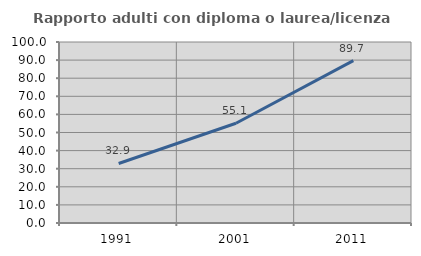
| Category | Rapporto adulti con diploma o laurea/licenza media  |
|---|---|
| 1991.0 | 32.896 |
| 2001.0 | 55.11 |
| 2011.0 | 89.728 |